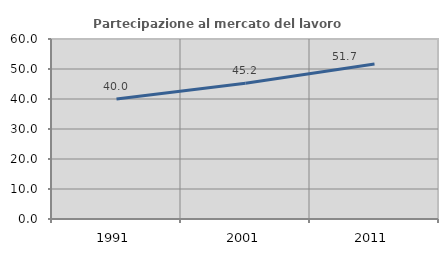
| Category | Partecipazione al mercato del lavoro  femminile |
|---|---|
| 1991.0 | 40.014 |
| 2001.0 | 45.229 |
| 2011.0 | 51.681 |